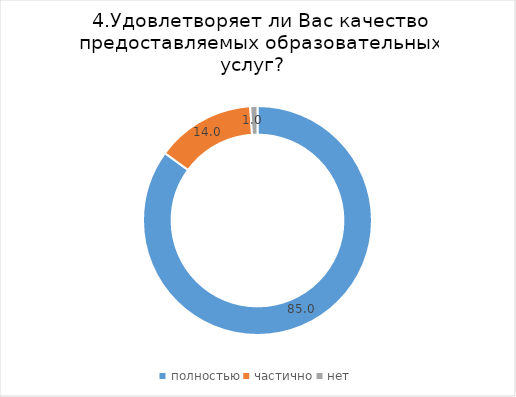
| Category | Series 0 |
|---|---|
| полностью | 85.011 |
| частично | 13.971 |
| нет | 1.017 |